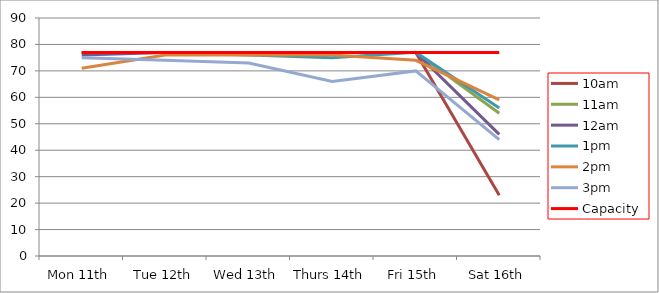
| Category | 9am | 10am | 11am | 12am | 1pm | 2pm | 3pm | 4pm | 5pm | Capacity |
|---|---|---|---|---|---|---|---|---|---|---|
| Mon 11th |  | 77 | 77 | 76 | 77 | 71 | 75 |  |  | 77 |
| Tue 12th |  | 77 | 77 | 77 | 77 | 76 | 74 |  |  | 77 |
| Wed 13th |  | 77 | 77 | 77 | 76 | 76 | 73 |  |  | 77 |
| Thurs 14th |  | 77 | 77 | 77 | 75 | 76 | 66 |  |  | 77 |
| Fri 15th |  | 77 | 77 | 77 | 77 | 74 | 70 |  |  | 77 |
| Sat 16th |  | 23 | 54 | 46 | 56 | 59 | 44 |  |  | 77 |